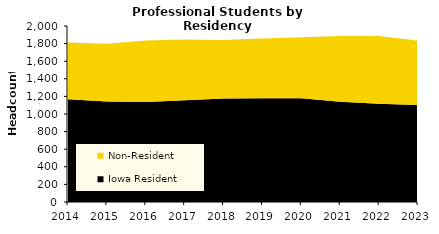
| Category | Iowa Resident | Non-Resident |
|---|---|---|
| 2014.0 | 1169 | 643 |
| 2015.0 | 1143 | 656 |
| 2016.0 | 1137 | 698 |
| 2017.0 | 1155 | 692 |
| 2018.0 | 1175 | 666 |
| 2019.0 | 1179 | 678 |
| 2020.0 | 1179 | 694 |
| 2021.0 | 1140 | 746 |
| 2022.0 | 1116 | 770 |
| 2023.0 | 1101 | 732 |